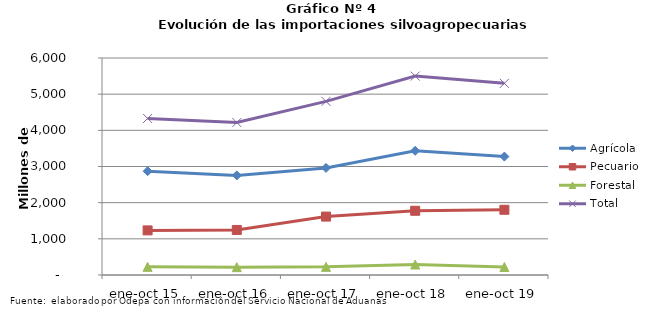
| Category | Agrícola | Pecuario | Forestal | Total |
|---|---|---|---|---|
| ene-oct 15 | 2870010 | 1233208 | 225417 | 4328635 |
| ene-oct 16 | 2753980 | 1245143 | 217006 | 4216129 |
| ene-oct 17 | 2961424 | 1615108 | 224714 | 4801246 |
| ene-oct 18 | 3434155 | 1775986 | 289524 | 5499665 |
| ene-oct 19 | 3274243 | 1803232 | 222098 | 5299573 |